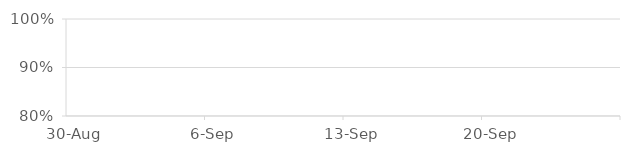
| Category | SNS | ABN |
|---|---|---|
| 2015-08-30 | 0 | 0 |
| 2015-08-31 | 0 | 0 |
| 2015-09-01 | 0 | 0 |
| 2015-09-02 | 0 | 0 |
| 2015-09-03 | 0 | 0 |
| 2015-09-04 | 0 | 0 |
| 2015-09-05 | 0 | 0 |
| 2015-09-06 | 0 | 0 |
| 2015-09-07 | 0 | 0 |
| 2015-09-08 | 0 | 0 |
| 2015-09-09 | 0 | 0 |
| 2015-09-10 | 0 | 0 |
| 2015-09-11 | 0 | 0 |
| 2015-09-12 | 0 | 0 |
| 2015-09-13 | 0 | 0 |
| 2015-09-14 | 0 | 0 |
| 2015-09-15 | 0 | 0 |
| 2015-09-16 | 0 | 0 |
| 2015-09-17 | 0 | 0 |
| 2015-09-18 | 0 | 0 |
| 2015-09-19 | 0 | 0 |
| 2015-09-20 | 0 | 0 |
| 2015-09-21 | 0 | 0 |
| 2015-09-22 | 0 | 0 |
| 2015-09-23 | 0 | 0 |
| 2015-09-24 | 0 | 0 |
| 2015-09-25 | 0 | 0 |
| 2015-09-26 | 0 | 0 |